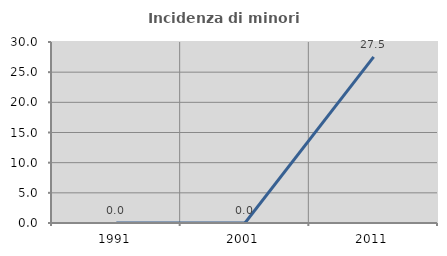
| Category | Incidenza di minori stranieri |
|---|---|
| 1991.0 | 0 |
| 2001.0 | 0 |
| 2011.0 | 27.523 |